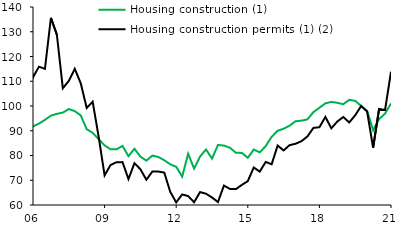
| Category | Housing construction (1) | Housing construction permits (1) (2) |
|---|---|---|
| 2005-03-31 | 86.206 | 93.632 |
| 2005-06-30 | 88.239 | 108.351 |
| 2005-09-30 | 88.932 | 110.845 |
| 2005-12-31 | 89.342 | 122.867 |
| 2006-03-31 | 91.736 | 111.565 |
| 2006-06-30 | 92.886 | 115.911 |
| 2006-09-30 | 94.398 | 115.013 |
| 2006-12-31 | 96.092 | 135.612 |
| 2007-03-31 | 96.827 | 128.811 |
| 2007-06-30 | 97.315 | 107.156 |
| 2007-09-30 | 98.771 | 110.151 |
| 2007-12-31 | 97.945 | 115.017 |
| 2008-03-31 | 96.203 | 109.206 |
| 2008-06-30 | 90.631 | 99.219 |
| 2008-09-30 | 89.15 | 101.721 |
| 2008-12-31 | 86.63 | 87.6 |
| 2009-03-31 | 84.072 | 71.974 |
| 2009-06-30 | 82.515 | 76.157 |
| 2009-09-30 | 82.492 | 77.294 |
| 2009-12-31 | 83.878 | 77.328 |
| 2010-03-31 | 79.723 | 70.477 |
| 2010-06-30 | 82.725 | 76.873 |
| 2010-09-30 | 79.551 | 74.446 |
| 2010-12-31 | 77.919 | 70.206 |
| 2011-03-31 | 79.955 | 73.506 |
| 2011-06-30 | 79.4 | 73.514 |
| 2011-09-30 | 78.092 | 73.098 |
| 2011-12-31 | 76.434 | 65.336 |
| 2012-03-31 | 75.444 | 61.051 |
| 2012-06-30 | 71.463 | 64.256 |
| 2012-09-30 | 80.698 | 63.611 |
| 2012-12-31 | 74.709 | 61.126 |
| 2013-03-31 | 79.6 | 65.223 |
| 2013-06-30 | 82.443 | 64.557 |
| 2013-09-30 | 78.745 | 63.037 |
| 2013-12-31 | 84.239 | 61.202 |
| 2014-03-31 | 84.015 | 67.844 |
| 2014-06-30 | 83.15 | 66.509 |
| 2014-09-30 | 81.103 | 66.411 |
| 2014-12-31 | 81.048 | 68.116 |
| 2015-03-31 | 79.067 | 69.652 |
| 2015-06-30 | 82.411 | 75.161 |
| 2015-09-30 | 81.274 | 73.491 |
| 2015-12-31 | 83.794 | 77.396 |
| 2016-03-31 | 87.565 | 76.458 |
| 2016-06-30 | 89.999 | 84.027 |
| 2016-09-30 | 90.805 | 82.038 |
| 2016-12-31 | 92.045 | 84.182 |
| 2017-03-31 | 93.845 | 84.74 |
| 2017-06-30 | 94.069 | 85.796 |
| 2017-09-30 | 94.61 | 87.715 |
| 2017-12-31 | 97.557 | 91.164 |
| 2018-03-31 | 99.284 | 91.421 |
| 2018-06-30 | 101.06 | 95.579 |
| 2018-09-30 | 101.649 | 90.992 |
| 2018-12-31 | 101.301 | 93.714 |
| 2019-03-31 | 100.721 | 95.558 |
| 2019-06-30 | 102.489 | 93.345 |
| 2019-09-30 | 102.08 | 96.258 |
| 2019-12-31 | 100 | 100 |
| 2020-03-31 | 98.058 | 97.73 |
| 2020-06-30 | 90.167 | 83.128 |
| 2020-09-30 | 94.686 | 98.776 |
| 2020-12-31 | 96.93 | 98.347 |
| 2021-03-31 | 101.008 | 113.861 |